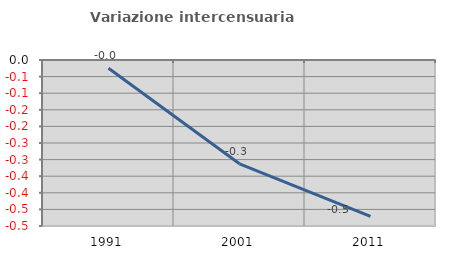
| Category | Variazione intercensuaria annua |
|---|---|
| 1991.0 | -0.025 |
| 2001.0 | -0.313 |
| 2011.0 | -0.471 |